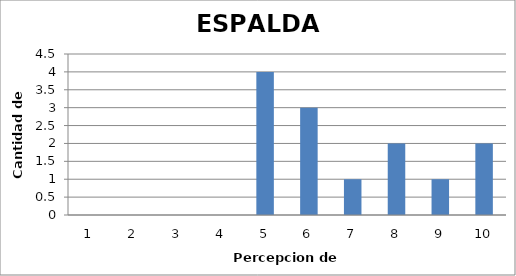
| Category | Series 0 |
|---|---|
| 0 | 0 |
| 1 | 0 |
| 2 | 0 |
| 3 | 0 |
| 4 | 4 |
| 5 | 3 |
| 6 | 1 |
| 7 | 2 |
| 8 | 1 |
| 9 | 2 |